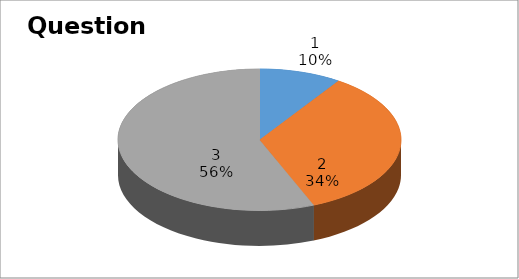
| Category | Series 0 |
|---|---|
| 0 | 3 |
| 1 | 11 |
| 2 | 18 |